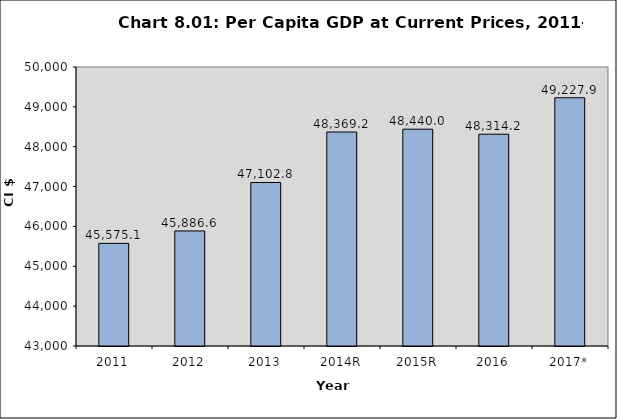
| Category | Series 0 |
|---|---|
| 2011 | 45575.1 |
| 2012 | 45886.6 |
| 2013 | 47102.8 |
| 2014R | 48369.2 |
| 2015R | 48440 |
| 2016 | 48314.2 |
| 2017* | 49227.9 |